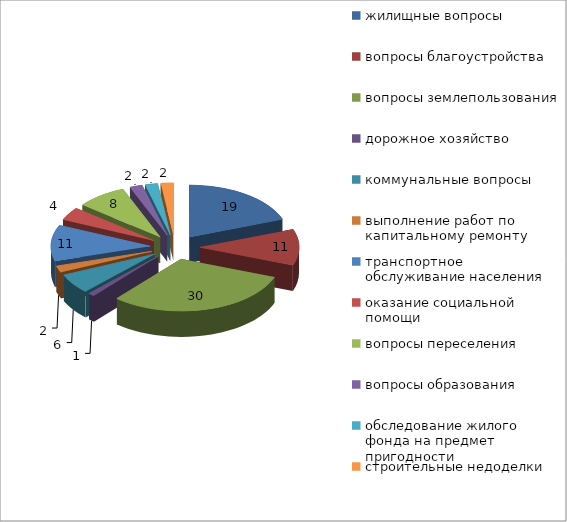
| Category | Series 0 |
|---|---|
| жилищные вопросы | 19 |
| вопросы благоустройства | 11 |
| вопросы землепользования | 30 |
| дорожное хозяйство | 1 |
| коммунальные вопросы | 6 |
| выполнение работ по капитальному ремонту | 2 |
| транспортное обслуживание населения | 11 |
| оказание социальной помощи | 4 |
| вопросы переселения | 8 |
| вопросы образования | 2 |
| обследование жилого фонда на предмет пригодности | 2 |
| строительные недоделки | 2 |